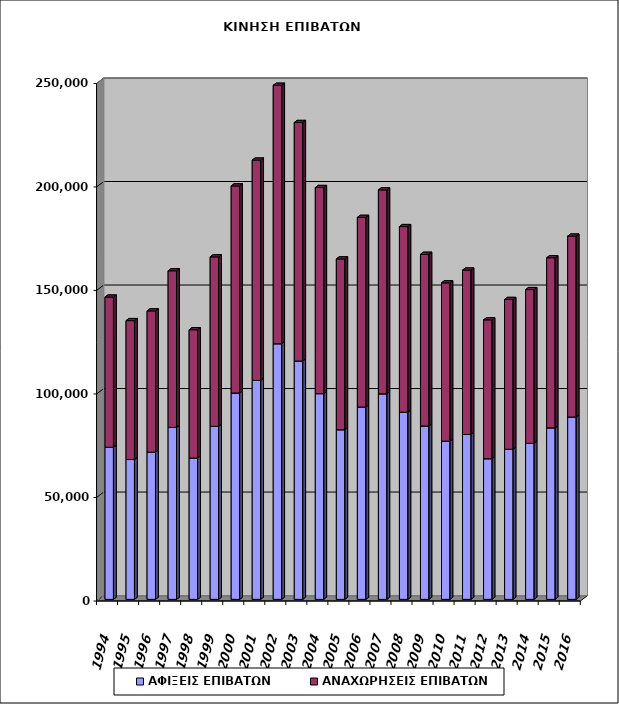
| Category | ΑΦΙΞΕΙΣ ΕΠΙΒΑΤΩΝ | ΑΝΑΧΩΡΗΣΕΙΣ ΕΠΙΒΑΤΩΝ |
|---|---|---|
| 1994.0 | 73485 | 72526 |
| 1995.0 | 67552 | 67089 |
| 1996.0 | 71107 | 68228 |
| 1997.0 | 83060 | 75649 |
| 1998.0 | 68270 | 61963 |
| 1999.0 | 83575 | 81859 |
| 2000.0 | 99675 | 100038 |
| 2001.0 | 105771 | 106409 |
| 2002.0 | 123473 | 124858 |
| 2003.0 | 115122 | 115218 |
| 2004.0 | 99375 | 99558 |
| 2005.0 | 81938 | 82502 |
| 2006.0 | 92926 | 91584 |
| 2007.0 | 99285 | 98484 |
| 2008.0 | 90436 | 89632 |
| 2009.0 | 83767 | 82907 |
| 2010.0 | 76429 | 76432 |
| 2011.0 | 79651 | 79385 |
| 2012.0 | 67933 | 67080 |
| 2013.0 | 72512 | 72343 |
| 2014.0 | 75370 | 74255 |
| 2015.0 | 82857 | 82143 |
| 2016.0 | 88068 | 87396 |